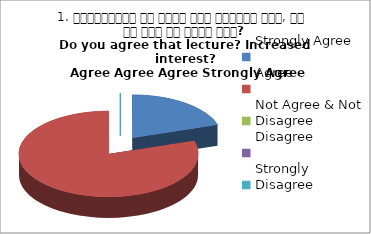
| Category | 1. व्याख्यान से रूचि में वृद्धि हुई, आप इस बात से सहमत हैं?
Do you agree that lecture? Increased interest?
 Agree Agree Agree Strongly Agree Agree |
|---|---|
| Strongly Agree | 1 |
| Agree | 4 |
| Not Agree & Not Disagree | 0 |
| Disagree | 0 |
| Strongly Disagree | 0 |